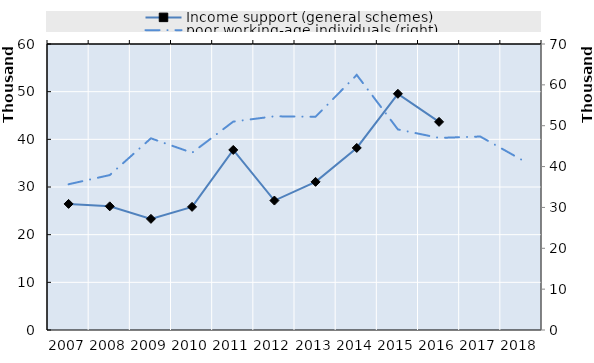
| Category | Income support (general schemes) | 0 | Series 14 | Series 15 | Series 16 | Series 17 | Series 18 |
|---|---|---|---|---|---|---|---|
| 2007.0 | 26451 |  |  |  |  |  |  |
| 2008.0 | 25943 |  |  |  |  |  |  |
| 2009.0 | 23313.25 |  |  |  |  |  |  |
| 2010.0 | 25833 |  |  |  |  |  |  |
| 2011.0 | 37773.75 |  |  |  |  |  |  |
| 2012.0 | 27155.25 |  |  |  |  |  |  |
| 2013.0 | 31079 |  |  |  |  |  |  |
| 2014.0 | 38192 |  |  |  |  |  |  |
| 2015.0 | 49551 |  |  |  |  |  |  |
| 2016.0 | 43664 |  |  |  |  |  |  |
| 2017.0 | 0 |  |  |  |  |  |  |
| 2018.0 | 0 |  |  |  |  |  |  |